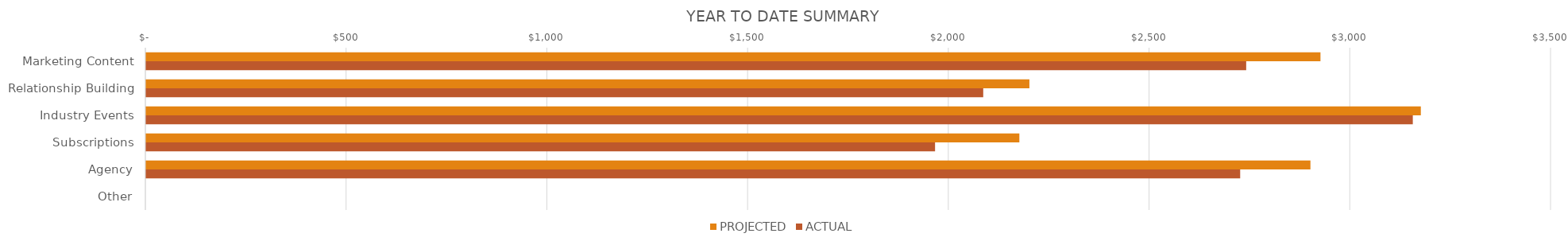
| Category | PROJECTED | ACTUAL |
|---|---|---|
| Marketing Content | 2925 | 2740 |
| Relationship Building | 2200 | 2085 |
| Industry Events | 3175 | 3155 |
| Subscriptions | 2175 | 1965 |
| Agency | 2900 | 2725 |
| Other | 0 | 0 |